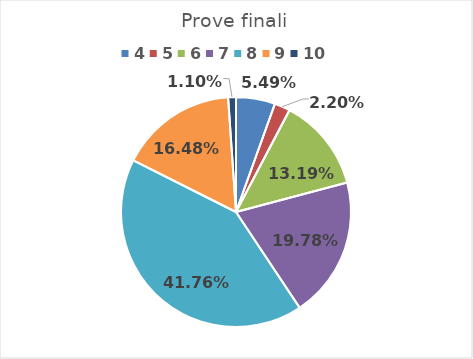
| Category | Series 0 |
|---|---|
| 4.0 | 0.055 |
| 5.0 | 0.022 |
| 6.0 | 0.132 |
| 7.0 | 0.198 |
| 8.0 | 0.418 |
| 9.0 | 0.165 |
| 10.0 | 0.011 |